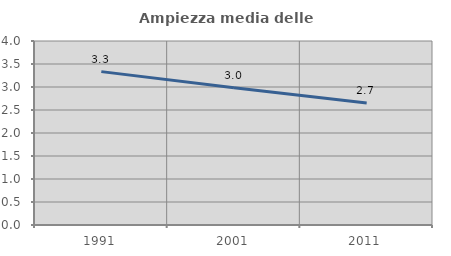
| Category | Ampiezza media delle famiglie |
|---|---|
| 1991.0 | 3.334 |
| 2001.0 | 2.982 |
| 2011.0 | 2.654 |